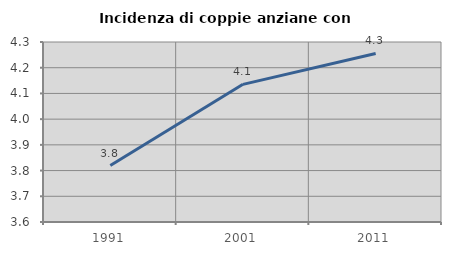
| Category | Incidenza di coppie anziane con figli |
|---|---|
| 1991.0 | 3.819 |
| 2001.0 | 4.135 |
| 2011.0 | 4.255 |